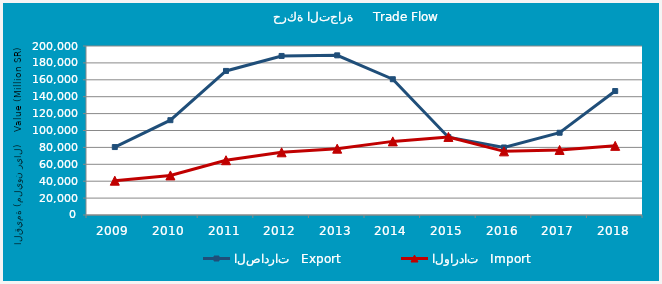
| Category | الصادرات   Export | الواردات   Import |
|---|---|---|
| 2009.0 | 80417434081 | 40601283030 |
| 2010.0 | 112210312640 | 46851348070 |
| 2011.0 | 170500056620 | 64828773564 |
| 2012.0 | 188229064082 | 74194573377 |
| 2013.0 | 188936496554 | 78487711837 |
| 2014.0 | 160680232253 | 87121670558 |
| 2015.0 | 92069105380 | 92397906991 |
| 2016.0 | 79916120973 | 75308864948 |
| 2017.0 | 97353798719 | 76971425937 |
| 2018.0 | 146702947110 | 81821161996 |